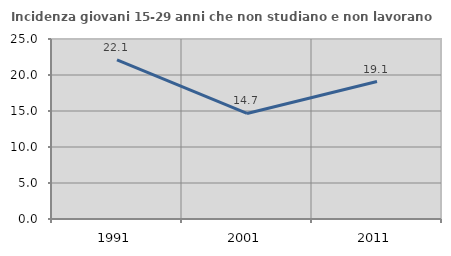
| Category | Incidenza giovani 15-29 anni che non studiano e non lavorano  |
|---|---|
| 1991.0 | 22.111 |
| 2001.0 | 14.662 |
| 2011.0 | 19.095 |